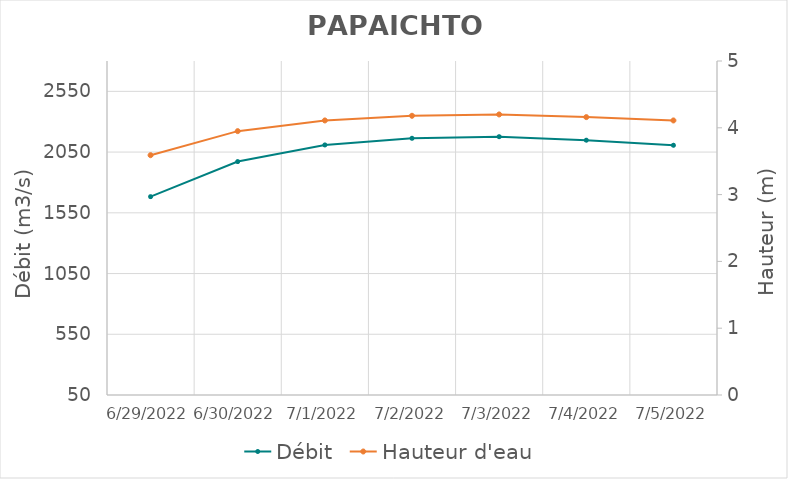
| Category | Débit |
|---|---|
| 6/29/22 | 1618 |
| 6/28/22 | 1477.2 |
| 6/27/22 | 1496.09 |
| 6/26/22 | 1584.05 |
| 6/25/22 | 1645.45 |
| 6/24/22 | 1664.38 |
| 6/23/22 | 1705 |